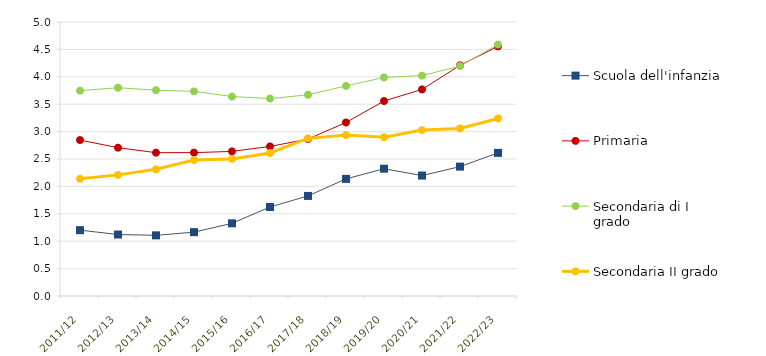
| Category | Scuola dell'infanzia | Primaria | Secondaria di I grado | Secondaria II grado |
|---|---|---|---|---|
| 2011/12 | 1.202 | 2.846 | 3.747 | 2.139 |
| 2012/13 | 1.122 | 2.706 | 3.8 | 2.21 |
| 2013/14 | 1.107 | 2.615 | 3.756 | 2.311 |
| 2014/15 | 1.165 | 2.616 | 3.734 | 2.481 |
| 2015/16 | 1.326 | 2.639 | 3.64 | 2.502 |
| 2016/17 | 1.624 | 2.729 | 3.602 | 2.61 |
| 2017/18 | 1.826 | 2.863 | 3.672 | 2.876 |
| 2018/19 | 2.137 | 3.166 | 3.834 | 2.937 |
| 2019/20 | 2.323 | 3.558 | 3.989 | 2.897 |
| 2020/21 | 2.198 | 3.77 | 4.021 | 3.027 |
| 2021/22 | 2.361 | 4.209 | 4.195 | 3.057 |
| 2022/23 | 2.612 | 4.555 | 4.589 | 3.24 |